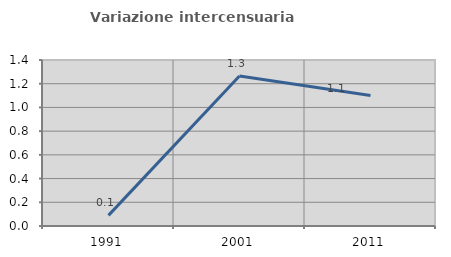
| Category | Variazione intercensuaria annua |
|---|---|
| 1991.0 | 0.09 |
| 2001.0 | 1.266 |
| 2011.0 | 1.101 |